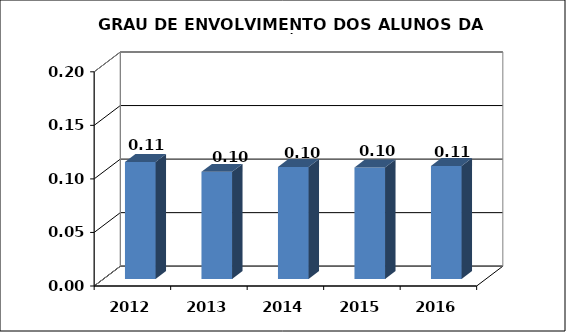
| Category | Series 0 |
|---|---|
| 2012 | 0.109 |
| 2013 | 0.1 |
| 2014 | 0.105 |
| 2015 | 0.104 |
| 2016 | 0.106 |